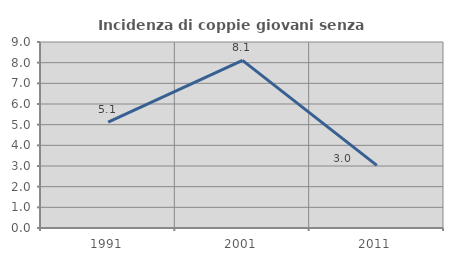
| Category | Incidenza di coppie giovani senza figli |
|---|---|
| 1991.0 | 5.128 |
| 2001.0 | 8.108 |
| 2011.0 | 3.03 |